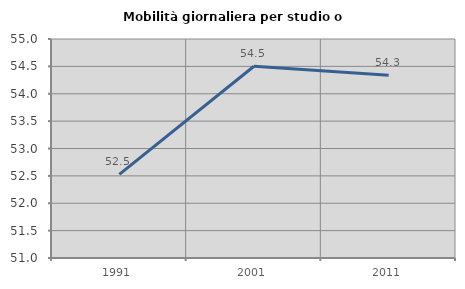
| Category | Mobilità giornaliera per studio o lavoro |
|---|---|
| 1991.0 | 52.527 |
| 2001.0 | 54.503 |
| 2011.0 | 54.337 |